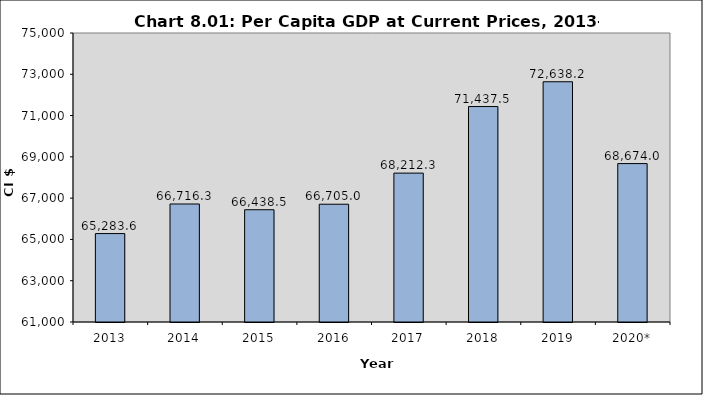
| Category | Series 0 |
|---|---|
| 2013 | 65283.559 |
| 2014 | 66716.312 |
| 2015 | 66438.463 |
| 2016 | 66705 |
| 2017 | 68212.3 |
| 2018 | 71437.5 |
| 2019 | 72638.2 |
| 2020* | 68674 |